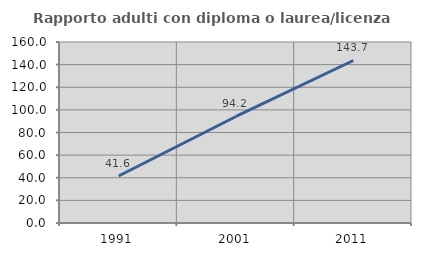
| Category | Rapporto adulti con diploma o laurea/licenza media  |
|---|---|
| 1991.0 | 41.558 |
| 2001.0 | 94.175 |
| 2011.0 | 143.662 |